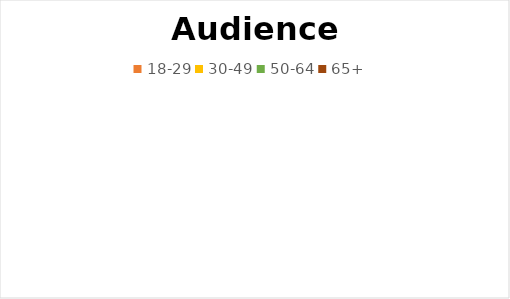
| Category | Series 0 |
|---|---|
| 18-29 | 0 |
| 30-49 | 0 |
| 50-64 | 0 |
| 65+ | 0 |